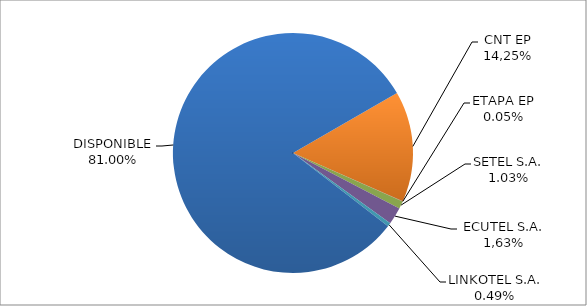
| Category | CODIGO DE AREA 4 |
|---|---|
| CORPORACIÓN NACIONAL TELECOMUNICACIONES CNT EP | 0.149 |
| ETAPA EP | 0.001 |
| SETEL S.A. | 0.01 |
| CONECEL (ex ECUADORTELECOM S.A.) | 0.023 |
| LINKOTEL S.A. | 0.005 |
| DISPONIBLE | 0.81 |